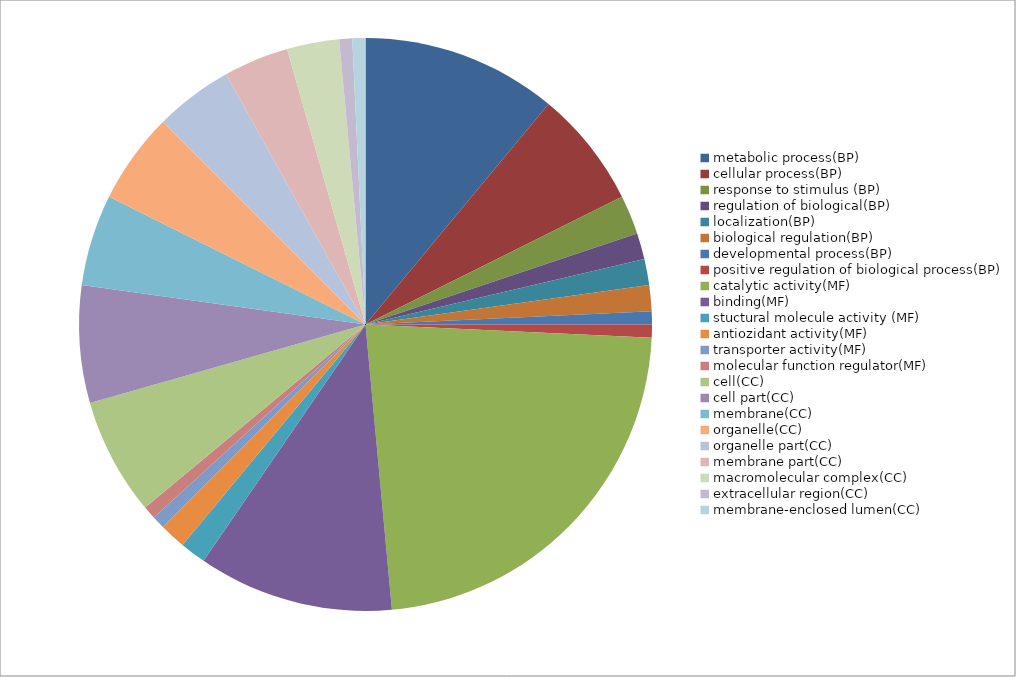
| Category | Series 0 |
|---|---|
| metabolic process(BP) | 15 |
| cellular process(BP) | 9 |
| response to stimulus (BP) | 3 |
| regulation of biological(BP) | 2 |
| localization(BP) | 2 |
| biological regulation(BP) | 2 |
| developmental process(BP) | 1 |
| positive regulation of biological process(BP) | 1 |
| catalytic activity(MF) | 31 |
| binding(MF) | 15 |
| stuctural molecule activity (MF) | 2 |
| antiozidant activity(MF) | 2 |
| transporter activity(MF) | 1 |
| molecular function regulator(MF) | 1 |
| cell(CC) | 9 |
| cell part(CC) | 9 |
| membrane(CC) | 7 |
| organelle(CC) | 7 |
| organelle part(CC) | 6 |
| membrane part(CC) | 5 |
| macromolecular complex(CC) | 4 |
| extracellular region(CC) | 1 |
| membrane-enclosed lumen(CC) | 1 |